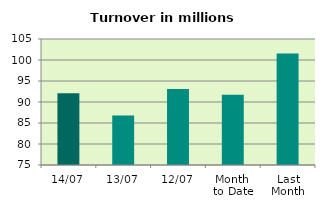
| Category | Series 0 |
|---|---|
| 14/07 | 92.082 |
| 13/07 | 86.801 |
| 12/07 | 93.117 |
| Month 
to Date | 91.741 |
| Last
Month | 101.544 |